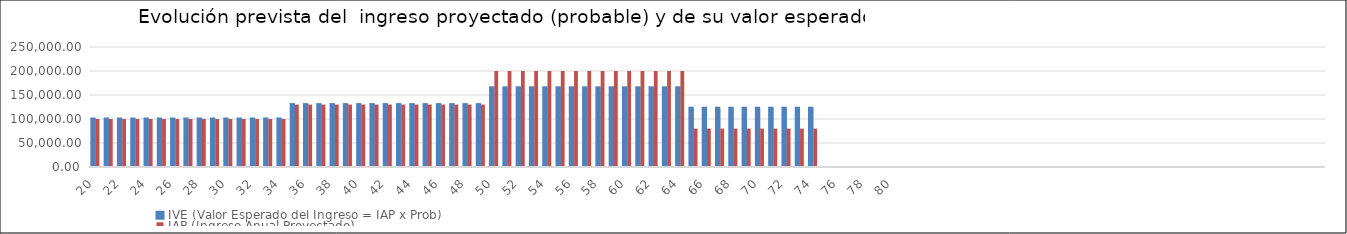
| Category | IVE (Valor Esperado del Ingreso = IAP x Prob) | IAP (Ingreso Anual Proyectado) |
|---|---|---|
| 20.0 | 100000 | 100000 |
| 21.0 | 100000 | 100000 |
| 22.0 | 100000 | 100000 |
| 23.0 | 100000 | 100000 |
| 24.0 | 100000 | 100000 |
| 25.0 | 100000 | 100000 |
| 26.0 | 100000 | 100000 |
| 27.0 | 100000 | 100000 |
| 28.0 | 100000 | 100000 |
| 29.0 | 100000 | 100000 |
| 30.0 | 100000 | 100000 |
| 31.0 | 100000 | 100000 |
| 32.0 | 100000 | 100000 |
| 33.0 | 100000 | 100000 |
| 34.0 | 100000 | 100000 |
| 35.0 | 130000 | 130000 |
| 36.0 | 130000 | 130000 |
| 37.0 | 130000 | 130000 |
| 38.0 | 130000 | 130000 |
| 39.0 | 130000 | 130000 |
| 40.0 | 130000 | 130000 |
| 41.0 | 130000 | 130000 |
| 42.0 | 130000 | 130000 |
| 43.0 | 130000 | 130000 |
| 44.0 | 130000 | 130000 |
| 45.0 | 130000 | 130000 |
| 46.0 | 130000 | 130000 |
| 47.0 | 130000 | 130000 |
| 48.0 | 130000 | 130000 |
| 49.0 | 130000 | 130000 |
| 50.0 | 165000 | 200000 |
| 51.0 | 165000 | 200000 |
| 52.0 | 165000 | 200000 |
| 53.0 | 165000 | 200000 |
| 54.0 | 165000 | 200000 |
| 55.0 | 165000 | 200000 |
| 56.0 | 165000 | 200000 |
| 57.0 | 165000 | 200000 |
| 58.0 | 165000 | 200000 |
| 59.0 | 165000 | 200000 |
| 60.0 | 165000 | 200000 |
| 61.0 | 165000 | 200000 |
| 62.0 | 165000 | 200000 |
| 63.0 | 165000 | 200000 |
| 64.0 | 165000 | 200000 |
| 65.0 | 122500 | 80000 |
| 66.0 | 122500 | 80000 |
| 67.0 | 122500 | 80000 |
| 68.0 | 122500 | 80000 |
| 69.0 | 122500 | 80000 |
| 70.0 | 122500 | 80000 |
| 71.0 | 122500 | 80000 |
| 72.0 | 122500 | 80000 |
| 73.0 | 122500 | 80000 |
| 74.0 | 122500 | 80000 |
| 75.0 | 0 | 0 |
| 76.0 | 0 | 0 |
| 77.0 | 0 | 0 |
| 78.0 | 0 | 0 |
| 79.0 | 0 | 0 |
| 80.0 | 0 | 0 |